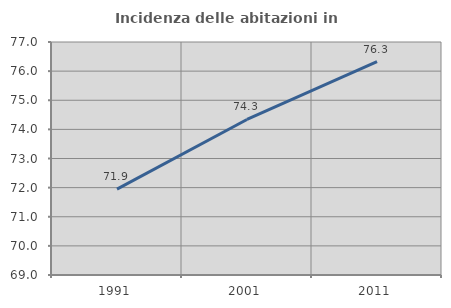
| Category | Incidenza delle abitazioni in proprietà  |
|---|---|
| 1991.0 | 71.946 |
| 2001.0 | 74.34 |
| 2011.0 | 76.33 |